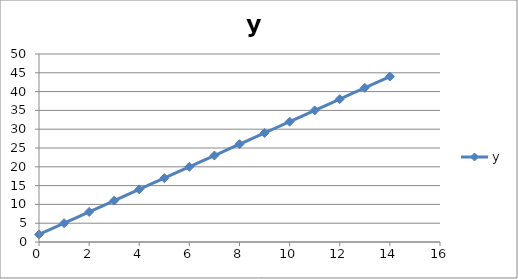
| Category | y |
|---|---|
| 0.0 | 2 |
| 1.0 | 5 |
| 2.0 | 8 |
| 3.0 | 11 |
| 4.0 | 14 |
| 5.0 | 17 |
| 6.0 | 20 |
| 7.0 | 23 |
| 8.0 | 26 |
| 9.0 | 29 |
| 10.0 | 32 |
| 11.0 | 35 |
| 12.0 | 38 |
| 13.0 | 41 |
| 14.0 | 44 |